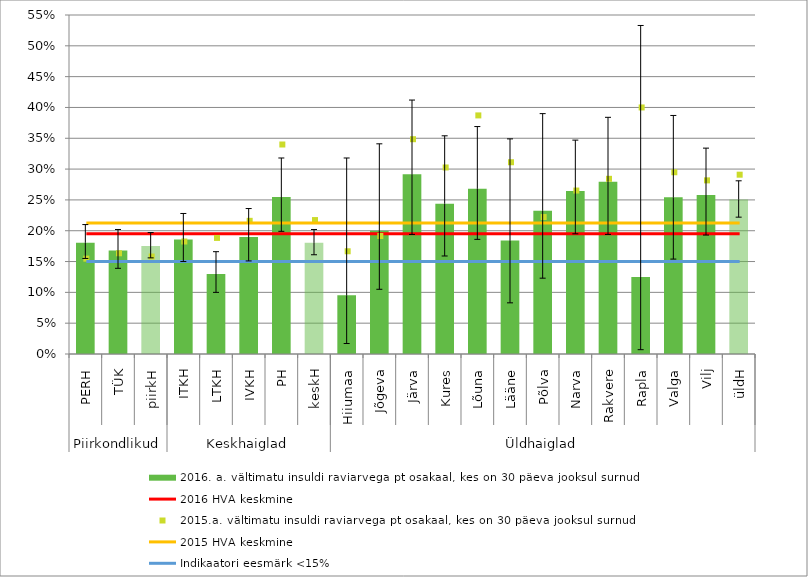
| Category | 2016. a. vältimatu insuldi raviarvega pt osakaal, kes on 30 päeva jooksul surnud |
|---|---|
| 0 | 0.18 |
| 1 | 0.168 |
| 2 | 0.175 |
| 3 | 0.186 |
| 4 | 0.13 |
| 5 | 0.19 |
| 6 | 0.255 |
| 7 | 0.18 |
| 8 | 0.095 |
| 9 | 0.2 |
| 10 | 0.292 |
| 11 | 0.244 |
| 12 | 0.268 |
| 13 | 0.184 |
| 14 | 0.233 |
| 15 | 0.264 |
| 16 | 0.28 |
| 17 | 0.125 |
| 18 | 0.254 |
| 19 | 0.258 |
| 20 | 0.251 |